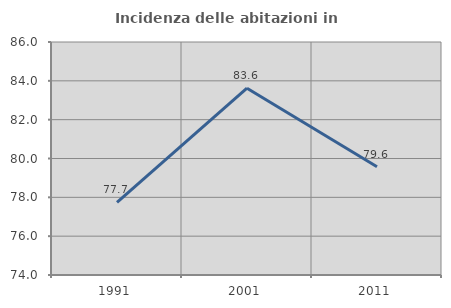
| Category | Incidenza delle abitazioni in proprietà  |
|---|---|
| 1991.0 | 77.742 |
| 2001.0 | 83.621 |
| 2011.0 | 79.576 |